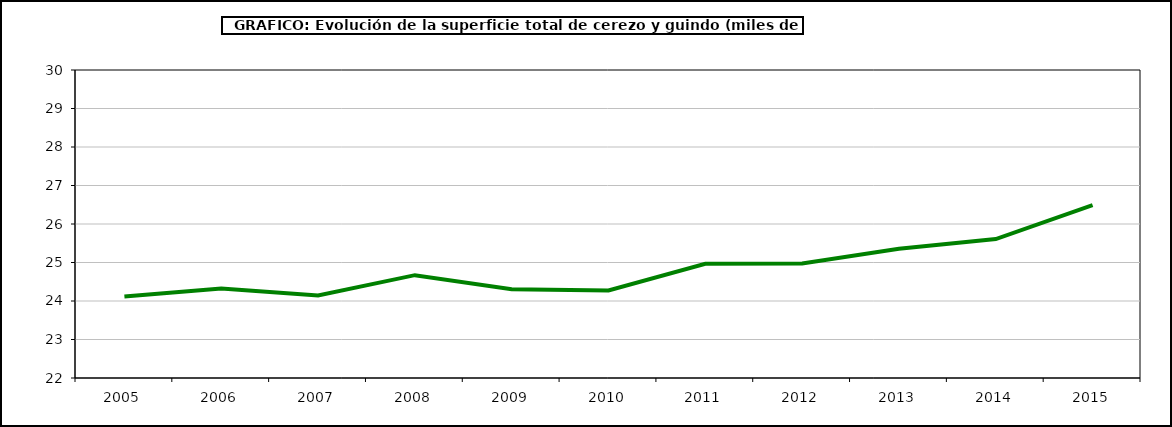
| Category | superficie cerezo y guindo |
|---|---|
| 2005.0 | 24.115 |
| 2006.0 | 24.326 |
| 2007.0 | 24.144 |
| 2008.0 | 24.671 |
| 2009.0 | 24.304 |
| 2010.0 | 24.275 |
| 2011.0 | 24.967 |
| 2012.0 | 24.972 |
| 2013.0 | 25.358 |
| 2014.0 | 25.608 |
| 2015.0 | 26.49 |